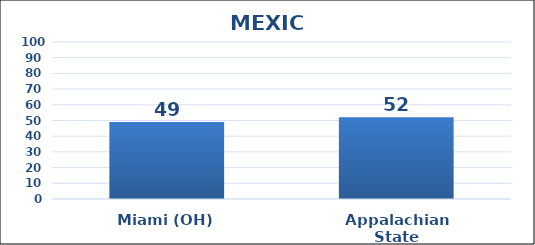
| Category | Series 0 |
|---|---|
| Miami (OH) | 49 |
| Appalachian State | 52 |